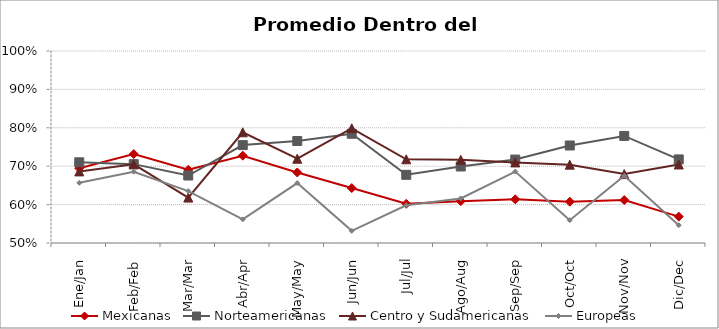
| Category | Mexicanas | Norteamericanas | Centro y Sudamericanas | Europeas |
|---|---|---|---|---|
| Ene/Jan | 0.695 | 0.71 | 0.686 | 0.657 |
| Feb/Feb | 0.732 | 0.705 | 0.705 | 0.686 |
| Mar/Mar | 0.691 | 0.676 | 0.618 | 0.635 |
| Abr/Apr | 0.727 | 0.755 | 0.788 | 0.562 |
| May/May | 0.684 | 0.766 | 0.72 | 0.656 |
| Jun/Jun | 0.643 | 0.784 | 0.799 | 0.532 |
| Jul/Jul | 0.602 | 0.678 | 0.718 | 0.598 |
| Ago/Aug | 0.609 | 0.699 | 0.717 | 0.616 |
| Sep/Sep | 0.614 | 0.717 | 0.71 | 0.686 |
| Oct/Oct | 0.607 | 0.754 | 0.704 | 0.559 |
| Nov/Nov | 0.612 | 0.779 | 0.679 | 0.675 |
| Dic/Dec | 0.569 | 0.718 | 0.704 | 0.546 |